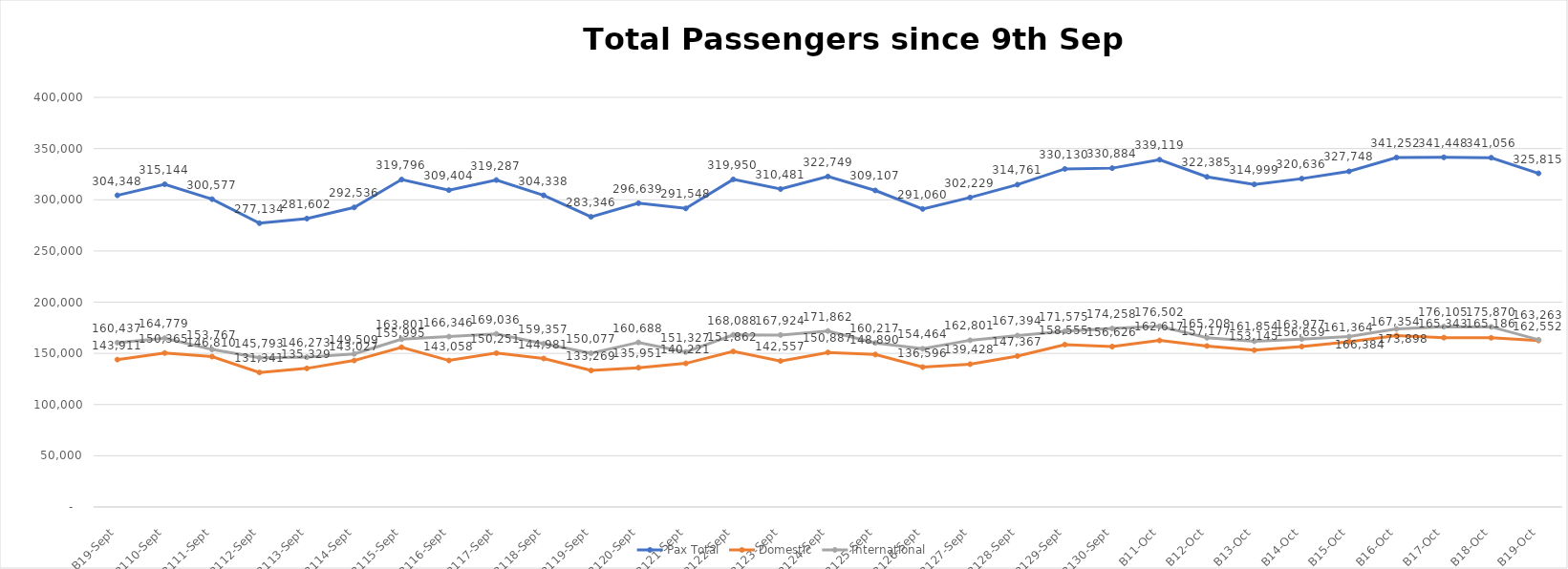
| Category | Pax Total | Domestic | International |
|---|---|---|---|
| 2023-09-09 | 304348 | 143911 | 160437 |
| 2023-09-10 | 315144 | 150365 | 164779 |
| 2023-09-11 | 300577 | 146810 | 153767 |
| 2023-09-12 | 277134 | 131341 | 145793 |
| 2023-09-13 | 281602 | 135329 | 146273 |
| 2023-09-14 | 292536 | 143027 | 149509 |
| 2023-09-15 | 319796 | 155995 | 163801 |
| 2023-09-16 | 309404 | 143058 | 166346 |
| 2023-09-17 | 319287 | 150251 | 169036 |
| 2023-09-18 | 304338 | 144981 | 159357 |
| 2023-09-19 | 283346 | 133269 | 150077 |
| 2023-09-20 | 296639 | 135951 | 160688 |
| 2023-09-21 | 291548 | 140221 | 151327 |
| 2023-09-22 | 319950 | 151862 | 168088 |
| 2023-09-23 | 310481 | 142557 | 167924 |
| 2023-09-24 | 322749 | 150887 | 171862 |
| 2023-09-25 | 309107 | 148890 | 160217 |
| 2023-09-26 | 291060 | 136596 | 154464 |
| 2023-09-27 | 302229 | 139428 | 162801 |
| 2023-09-28 | 314761 | 147367 | 167394 |
| 2023-09-29 | 330130 | 158555 | 171575 |
| 2023-09-30 | 330884 | 156626 | 174258 |
| 2023-10-01 | 339119 | 162617 | 176502 |
| 2023-10-02 | 322385 | 157177 | 165208 |
| 2023-10-03 | 314999 | 153145 | 161854 |
| 2023-10-04 | 320636 | 156659 | 163977 |
| 2023-10-05 | 327748 | 161364 | 166384 |
| 2023-10-06 | 341252 | 167354 | 173898 |
| 2023-10-07 | 341448 | 165343 | 176105 |
| 2023-10-08 | 341056 | 165186 | 175870 |
| 2023-10-09 | 325815 | 162552 | 163263 |